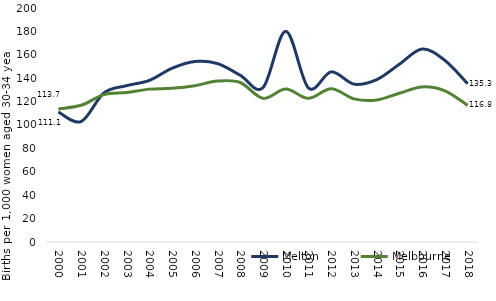
| Category | Melton  | Melbourne  |
|---|---|---|
| 2000.0 | 111.109 | 113.74 |
| 2001.0 | 102.921 | 116.844 |
| 2002.0 | 127.355 | 125.946 |
| 2003.0 | 133.626 | 127.723 |
| 2004.0 | 138.117 | 130.661 |
| 2005.0 | 148.512 | 131.391 |
| 2006.0 | 154.261 | 133.573 |
| 2007.0 | 152.498 | 137.545 |
| 2008.0 | 142.497 | 136.323 |
| 2009.0 | 131.928 | 122.775 |
| 2010.0 | 180.094 | 130.761 |
| 2011.0 | 131.615 | 122.759 |
| 2012.0 | 145.425 | 130.953 |
| 2013.0 | 134.942 | 122.344 |
| 2014.0 | 138.76 | 121.294 |
| 2015.0 | 151.974 | 127.113 |
| 2016.0 | 164.952 | 132.531 |
| 2017.0 | 155.207 | 129.146 |
| 2018.0 | 135.253 | 116.765 |